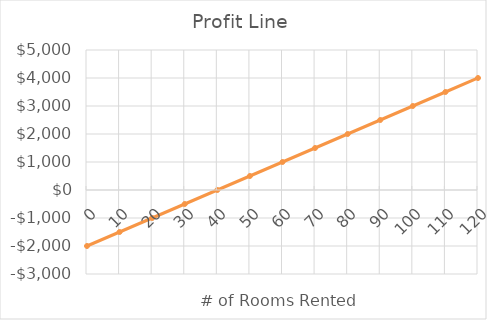
| Category | Profit |
|---|---|
| 0.0 | -2000 |
| 10.0 | -1500 |
| 20.0 | -1000 |
| 30.0 | -500 |
| 40.0 | 0 |
| 50.0 | 500 |
| 60.0 | 1000 |
| 70.0 | 1500 |
| 80.0 | 2000 |
| 90.0 | 2500 |
| 100.0 | 3000 |
| 110.0 | 3500 |
| 120.0 | 4000 |